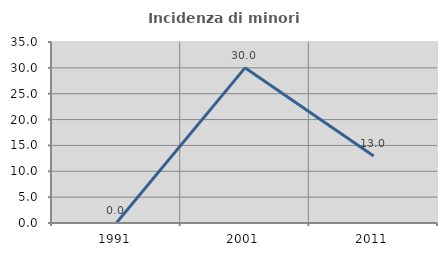
| Category | Incidenza di minori stranieri |
|---|---|
| 1991.0 | 0 |
| 2001.0 | 30 |
| 2011.0 | 12.963 |